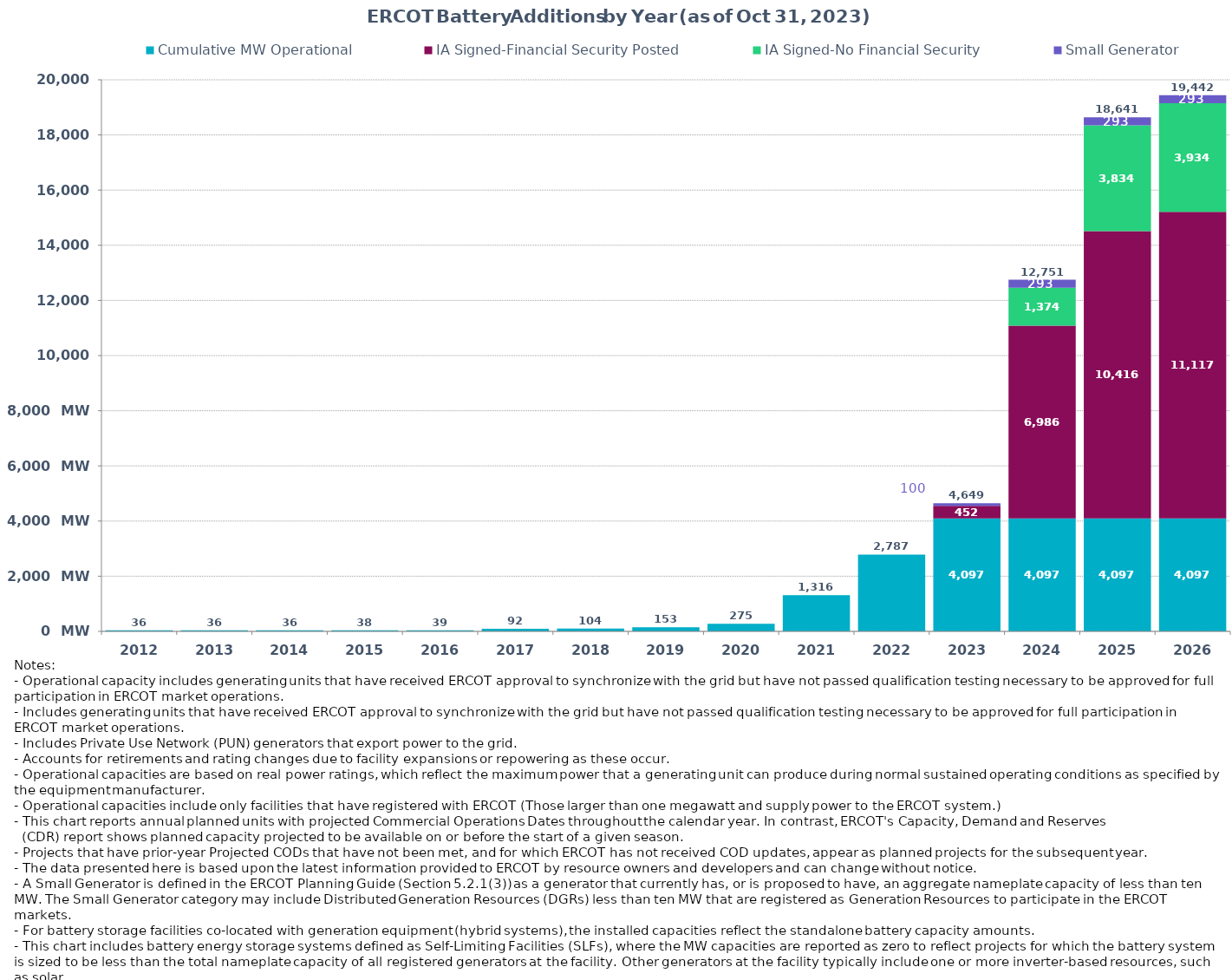
| Category | Cumulative MW Operational | IA Signed-Financial Security Posted  | IA Signed-No Financial Security  | Small Generator | Cumulative Installed and Planned |
|---|---|---|---|---|---|
| 2012.0 | 36 | 0 | 0 | 0 | 36 |
| 2013.0 | 36 | 0 | 0 | 0 | 36 |
| 2014.0 | 36 | 0 | 0 | 0 | 36 |
| 2015.0 | 38 | 0 | 0 | 0 | 38 |
| 2016.0 | 39 | 0 | 0 | 0 | 39 |
| 2017.0 | 92.3 | 0 | 0 | 0 | 92.3 |
| 2018.0 | 103.7 | 0 | 0 | 0 | 103.7 |
| 2019.0 | 153.3 | 0 | 0 | 0 | 153.3 |
| 2020.0 | 275.4 | 0 | 0 | 0 | 275.4 |
| 2021.0 | 1316.43 | 0 | 0 | 0 | 1316.43 |
| 2022.0 | 2786.86 | 0 | 0 | 0 | 2786.86 |
| 2023.0 | 4097.46 | 451.9 | 0 | 99.86 | 4649.22 |
| 2024.0 | 4097.46 | 6986.33 | 1373.71 | 293.46 | 12750.96 |
| 2025.0 | 4097.46 | 10416.04 | 3833.98 | 293.46 | 18640.94 |
| 2026.0 | 4097.46 | 11117.23 | 3933.98 | 293.46 | 19442.13 |